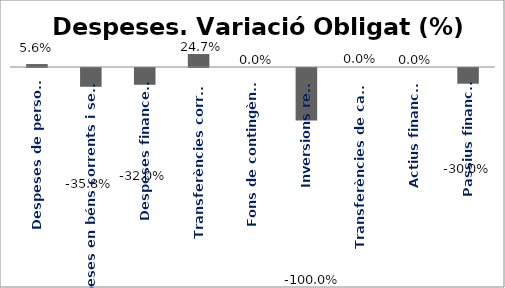
| Category | Series 0 |
|---|---|
| Despeses de personal | 0.056 |
| Despeses en béns corrents i serveis | -0.358 |
| Despeses financeres | -0.32 |
| Transferències corrents | 0.247 |
| Fons de contingència | 0 |
| Inversions reals | -1 |
| Transferències de capital | 0 |
| Actius financers | 0 |
| Passius financers | -0.3 |